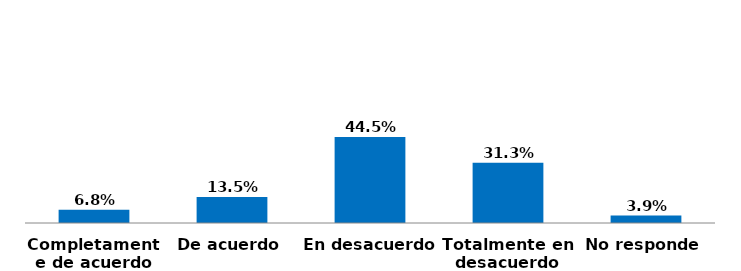
| Category | Series 0 |
|---|---|
| Completamente de acuerdo | 0.068 |
| De acuerdo | 0.135 |
| En desacuerdo | 0.445 |
| Totalmente en desacuerdo | 0.313 |
| No responde | 0.039 |